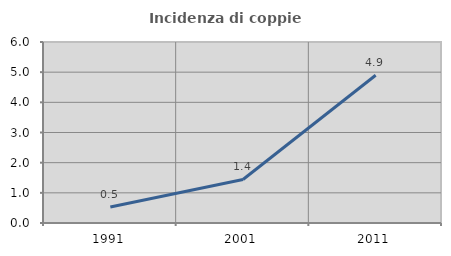
| Category | Incidenza di coppie miste |
|---|---|
| 1991.0 | 0.529 |
| 2001.0 | 1.442 |
| 2011.0 | 4.898 |